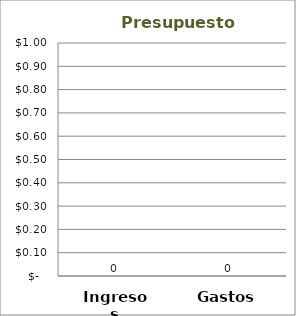
| Category | Series 0 |
|---|---|
| Ingresos | 0 |
| Gastos | 0 |